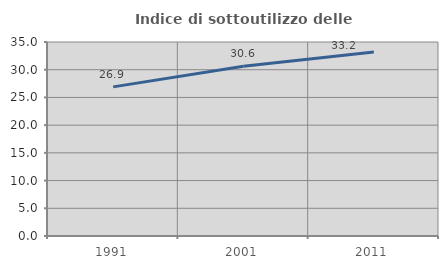
| Category | Indice di sottoutilizzo delle abitazioni  |
|---|---|
| 1991.0 | 26.906 |
| 2001.0 | 30.619 |
| 2011.0 | 33.178 |